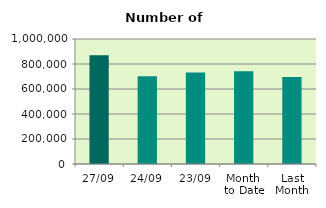
| Category | Series 0 |
|---|---|
| 27/09 | 869806 |
| 24/09 | 701826 |
| 23/09 | 731984 |
| Month 
to Date | 741534.842 |
| Last
Month | 695004.455 |